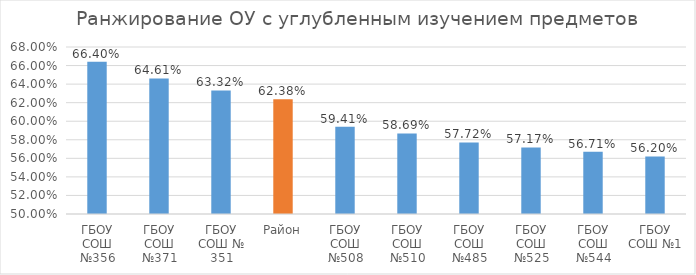
| Category | % выполнения |
|---|---|
| ГБОУ СОШ №356 | 0.664 |
| ГБОУ СОШ №371 | 0.646 |
| ГБОУ СОШ № 351 | 0.633 |
| Район | 0.624 |
| ГБОУ СОШ №508 | 0.594 |
| ГБОУ СОШ №510 | 0.587 |
| ГБОУ СОШ №485 | 0.577 |
| ГБОУ СОШ №525 | 0.572 |
| ГБОУ СОШ №544 | 0.567 |
| ГБОУ СОШ №1 | 0.562 |